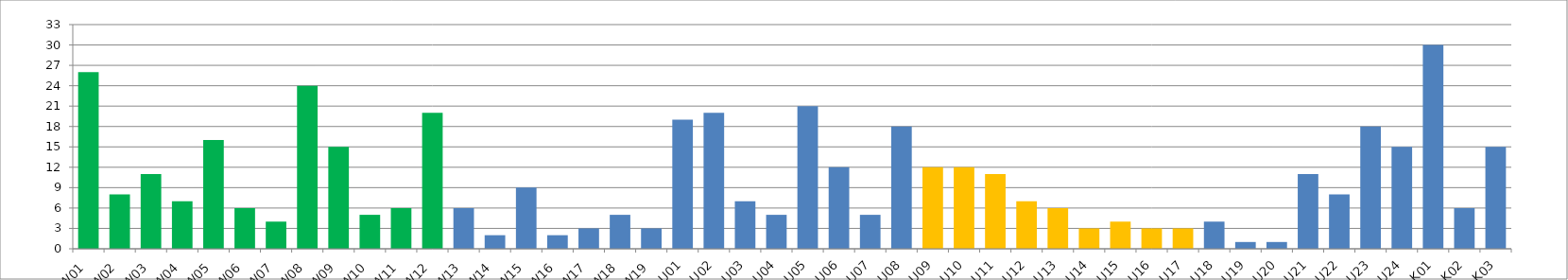
| Category | Series 0 |
|---|---|
| W01 | 26 |
| W02 | 8 |
| W03 | 11 |
| W04 | 7 |
| W05 | 16 |
| W06 | 6 |
| W07 | 4 |
| W08 | 24 |
| W09 | 15 |
| W10 | 5 |
| W11 | 6 |
| W12 | 20 |
| W13 | 6 |
| W14 | 2 |
| W15 | 9 |
| W16 | 2 |
| W17 | 3 |
| W18 | 5 |
| W19 | 3 |
| U01 | 19 |
| U02 | 20 |
| U03 | 7 |
| U04 | 5 |
| U05 | 21 |
| U06 | 12 |
| U07 | 5 |
| U08 | 18 |
| U09 | 12 |
| U10 | 12 |
| U11 | 11 |
| U12 | 7 |
| U13 | 6 |
| U14 | 3 |
| U15 | 4 |
| U16 | 3 |
| U17 | 3 |
| U18 | 4 |
| U19 | 1 |
| U20 | 1 |
| U21 | 11 |
| U22 | 8 |
| U23 | 18 |
| U24 | 15 |
| K01 | 30 |
| K02 | 6 |
| K03 | 15 |